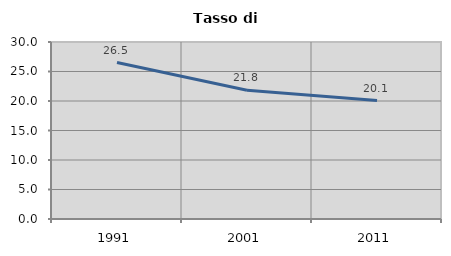
| Category | Tasso di disoccupazione   |
|---|---|
| 1991.0 | 26.51 |
| 2001.0 | 21.818 |
| 2011.0 | 20.066 |